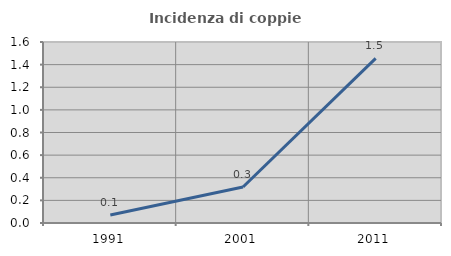
| Category | Incidenza di coppie miste |
|---|---|
| 1991.0 | 0.071 |
| 2001.0 | 0.318 |
| 2011.0 | 1.456 |